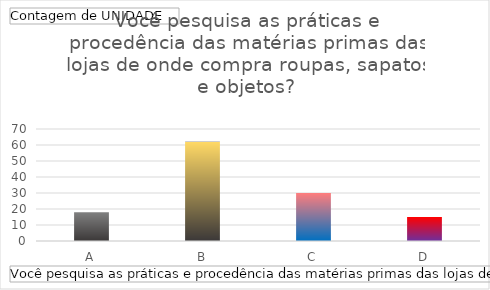
| Category | Total |
|---|---|
| A | 18 |
| B | 62 |
| C | 30 |
| D | 15 |